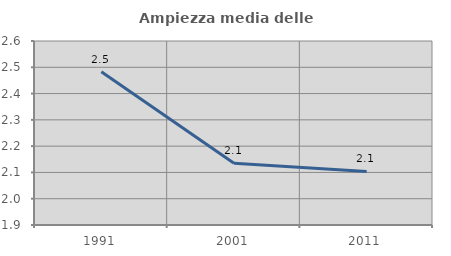
| Category | Ampiezza media delle famiglie |
|---|---|
| 1991.0 | 2.483 |
| 2001.0 | 2.135 |
| 2011.0 | 2.104 |